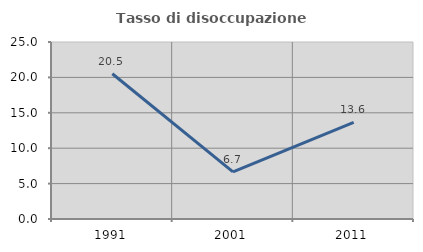
| Category | Tasso di disoccupazione giovanile  |
|---|---|
| 1991.0 | 20.513 |
| 2001.0 | 6.667 |
| 2011.0 | 13.636 |